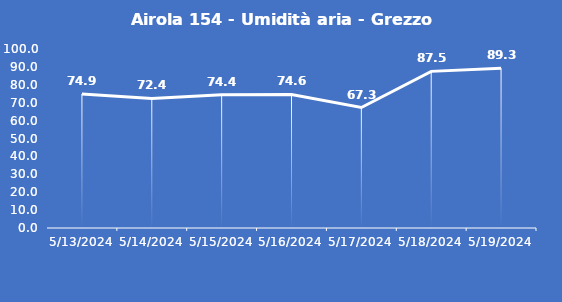
| Category | Airola 154 - Umidità aria - Grezzo (%) |
|---|---|
| 5/13/24 | 74.9 |
| 5/14/24 | 72.4 |
| 5/15/24 | 74.4 |
| 5/16/24 | 74.6 |
| 5/17/24 | 67.3 |
| 5/18/24 | 87.5 |
| 5/19/24 | 89.3 |